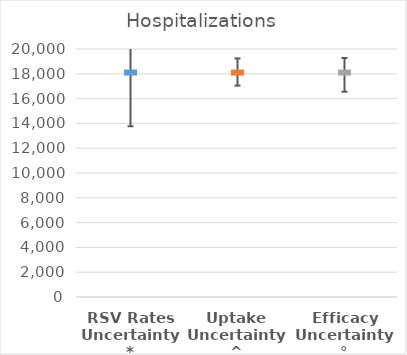
| Category | Series 0 |
|---|---|
| RSV Rates Uncertainty* | 18140 |
| Uptake Uncertainty^ | 18140 |
| Efficacy Uncertainty° | 18140 |